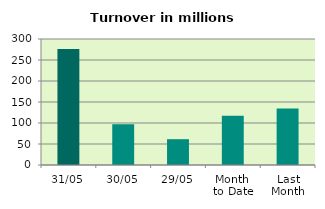
| Category | Series 0 |
|---|---|
| 31/05 | 276.323 |
| 30/05 | 97.069 |
| 29/05 | 61.442 |
| Month 
to Date | 117.306 |
| Last
Month | 134.694 |